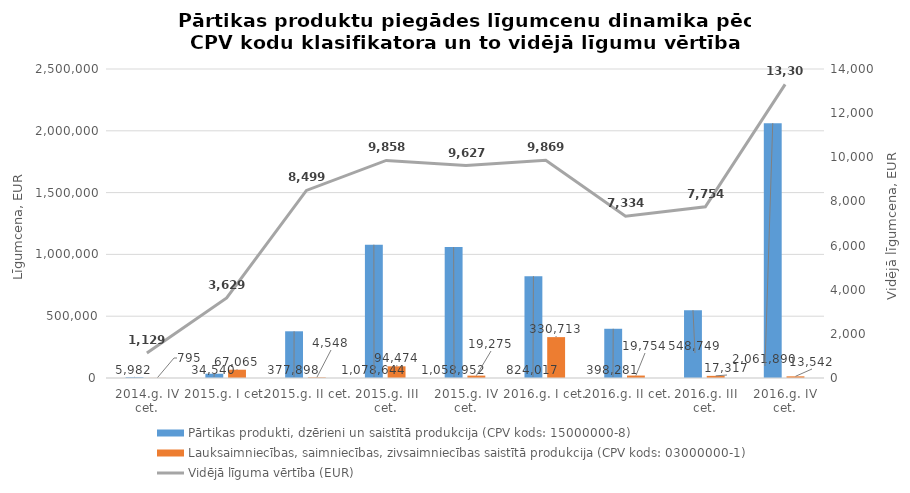
| Category | Pārtikas produkti, dzērieni un saistītā produkcija (CPV kods: 15000000-8) | Lauksaimniecības, saimniecības, zivsaimniecības saistītā produkcija (CPV kods: 03000000-1) |
|---|---|---|
| 2014.g. IV cet. | 5982 | 795 |
| 2015.g. I cet. | 34540 | 67065 |
| 2015.g. II cet. | 377898 | 4548 |
| 2015.g. III cet. | 1078644 | 94474 |
| 2015.g. IV cet. | 1058952 | 19275 |
| 2016.g. I cet. | 824017 | 330713 |
| 2016.g. II cet. | 398281 | 19754 |
| 2016.g. III cet. | 548749.01 | 17317 |
| 2016.g. IV cet. | 2061890 | 13542 |